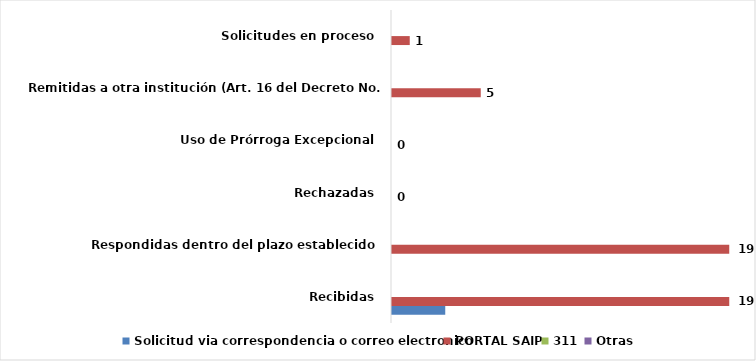
| Category | Solicitud via correspondencia o correo electronico | PORTAL SAIP | 311 | Otras |
|---|---|---|---|---|
| Recibidas  | 3 | 19 | 0 | 0 |
| Respondidas dentro del plazo establecido  | 0 | 19 | 0 | 0 |
| Rechazadas  | 0 | 0 | 0 | 0 |
| Uso de Prórroga Excepcional  | 0 | 0 | 0 | 0 |
| Remitidas a otra institución (Art. 16 del Decreto No. 130-05)  | 0 | 5 | 0 | 0 |
| Solicitudes en proceso  | 0 | 1 | 0 | 0 |